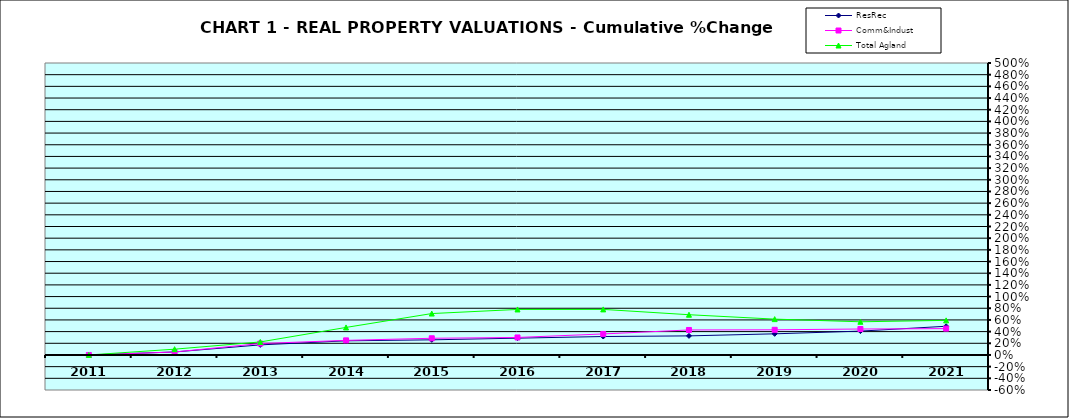
| Category | ResRec | Comm&Indust | Total Agland |
|---|---|---|---|
| 2011.0 | 0 | 0 | 0 |
| 2012.0 | 0.051 | 0.051 | 0.099 |
| 2013.0 | 0.173 | 0.196 | 0.223 |
| 2014.0 | 0.242 | 0.25 | 0.471 |
| 2015.0 | 0.259 | 0.286 | 0.709 |
| 2016.0 | 0.288 | 0.3 | 0.78 |
| 2017.0 | 0.316 | 0.36 | 0.78 |
| 2018.0 | 0.327 | 0.428 | 0.689 |
| 2019.0 | 0.362 | 0.431 | 0.614 |
| 2020.0 | 0.408 | 0.444 | 0.568 |
| 2021.0 | 0.491 | 0.452 | 0.593 |